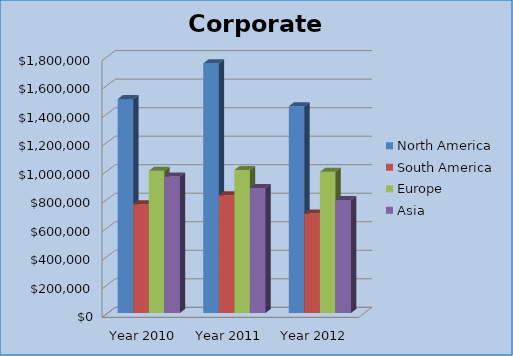
| Category | North America | South America | Europe | Asia |
|---|---|---|---|---|
| Year 2010 | 1500250 | 762500 | 997250 | 956700 |
| Year 2011 | 1750350 | 825735 | 1002500 | 876250 |
| Year 2012 | 1450000 | 697500 | 990025 | 792500 |